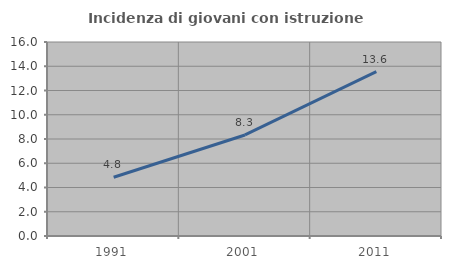
| Category | Incidenza di giovani con istruzione universitaria |
|---|---|
| 1991.0 | 4.848 |
| 2001.0 | 8.333 |
| 2011.0 | 13.553 |